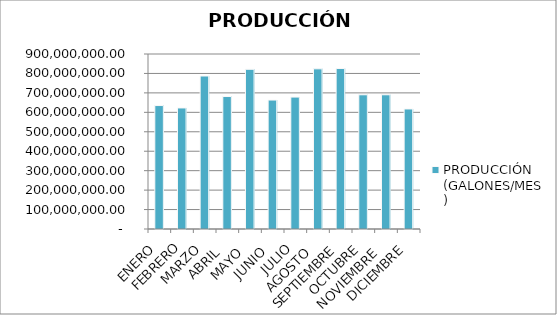
| Category | PRODUCCIÓN (GALONES/MES) |
|---|---|
| ENERO  | 634842778 |
| FEBRERO | 622571238.5 |
| MARZO | 786779406 |
| ABRIL  | 681309311.5 |
| MAYO  | 821330321.43 |
| JUNIO  | 663164858 |
| JULIO | 678400245.17 |
| AGOSTO  | 823777090.63 |
| SEPTIEMBRE | 825332290.63 |
| OCTUBRE | 690267747.4 |
| NOVIEMBRE  | 690267747.4 |
| DICIEMBRE | 617373539.75 |